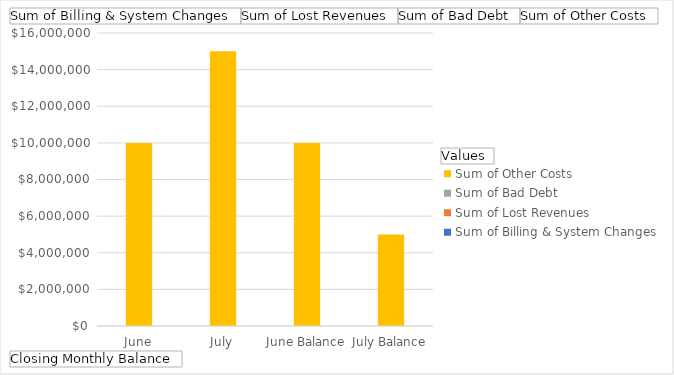
| Category | Sum of Billing & System Changes | Sum of Lost Revenues | Sum of Bad Debt | Sum of Other Costs |
|---|---|---|---|---|
| June | 0 | 0 | 0 | 10000000 |
| July | 0 | 0 | 0 | 15000000 |
| June Balance | 0 | 0 | 0 | 10000000 |
| July Balance | 0 | 0 | 0 | 5000000 |